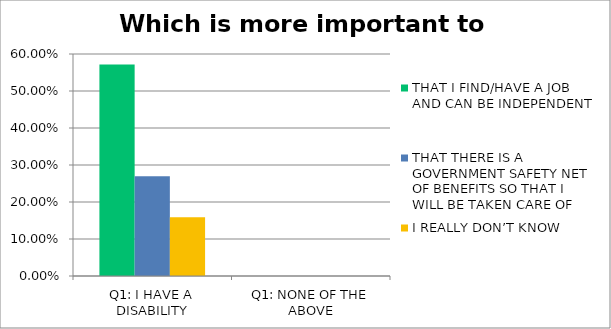
| Category | THAT I FIND/HAVE A JOB AND CAN BE INDEPENDENT | THAT THERE IS A GOVERNMENT SAFETY NET OF BENEFITS SO THAT I WILL BE TAKEN CARE OF | I REALLY DON’T KNOW |
|---|---|---|---|
| Q1: I HAVE A DISABILITY | 0.571 | 0.27 | 0.159 |
| Q1: NONE OF THE ABOVE | 0 | 0 | 0 |